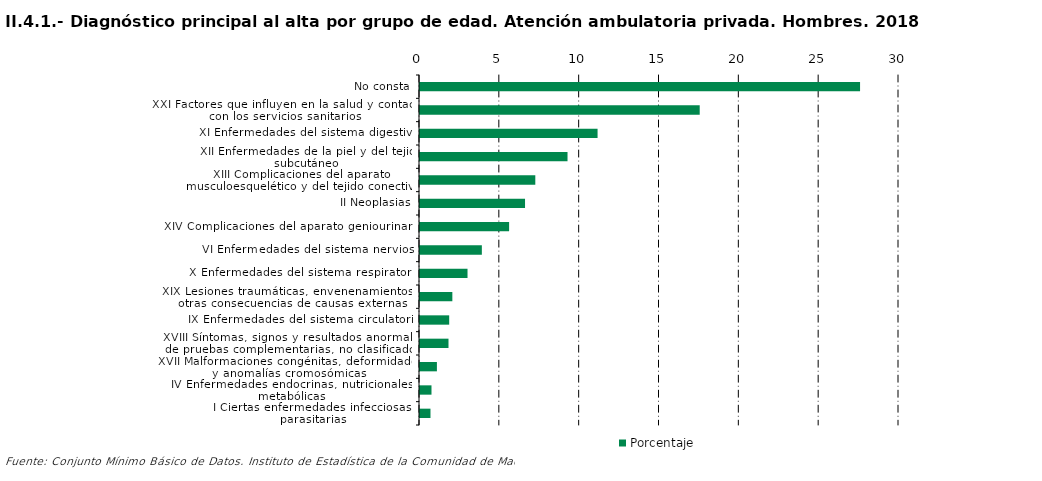
| Category | Porcentaje |
|---|---|
| No consta | 27.561 |
| XXI Factores que influyen en la salud y contacto con los servicios sanitarios | 17.518 |
| XI Enfermedades del sistema digestivo | 11.121 |
| XII Enfermedades de la piel y del tejido subcutáneo | 9.239 |
| XIII Complicaciones del aparato musculoesquelético y del tejido conectivo | 7.222 |
| II Neoplasias | 6.578 |
| XIV Complicaciones del aparato geniourinario | 5.581 |
| VI Enfermedades del sistema nervioso | 3.874 |
| X Enfermedades del sistema respiratorio | 2.976 |
| XIX Lesiones traumáticas, envenenamientos y otras consecuencias de causas externas | 2.026 |
| IX Enfermedades del sistema circulatorio | 1.828 |
| XVIII Síntomas, signos y resultados anormales de pruebas complementarias, no clasificados bajo otro concepto | 1.785 |
| XVII Malformaciones congénitas, deformidades y anomalías cromosómicas | 1.059 |
| IV Enfermedades endocrinas, nutricionales y metabólicas | 0.719 |
| I Ciertas enfermedades infecciosas y parasitarias | 0.656 |